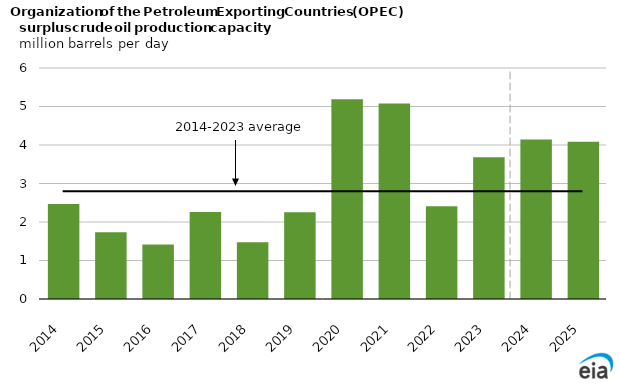
| Category | Series 1 |
|---|---|
| 2014.0 | 2.471 |
| 2015.0 | 1.735 |
| 2016.0 | 1.419 |
| 2017.0 | 2.261 |
| 2018.0 | 1.472 |
| 2019.0 | 2.252 |
| 2020.0 | 5.192 |
| 2021.0 | 5.075 |
| 2022.0 | 2.409 |
| 2023.0 | 3.68 |
| 2024.0 | 4.146 |
| 2025.0 | 4.087 |